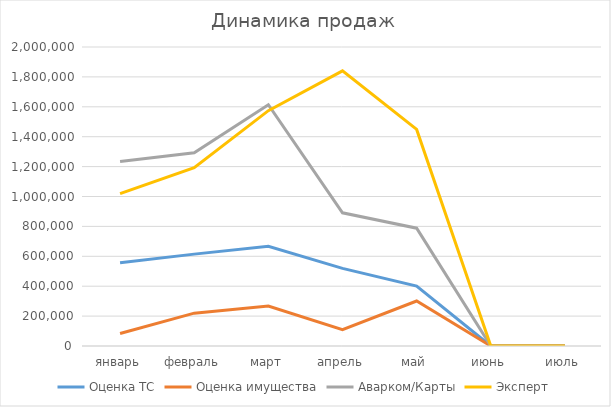
| Category | Оценка ТС | Оценка имущества | Аварком/Карты | Эксперт |
|---|---|---|---|---|
| январь | 556274 | 83900 | 1234810 | 1018946 |
| февраль | 614566 | 219700 | 1292567 | 1193500 |
| март | 667590 | 266800 | 1613792 | 1574168 |
| апрель | 518910 | 108600 | 891000 | 1840598 |
| май | 400237 | 301050 | 787930 | 1448899 |
| июнь | 0 | 0 | 0 | 0 |
| июль | 0 | 0 | 0 | 0 |